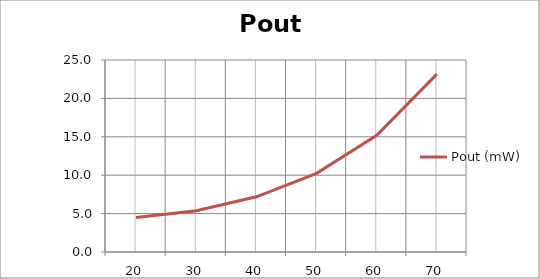
| Category | Pout (mW) |
|---|---|
| 20.0 | 4.491 |
| 30.0 | 5.366 |
| 40.0 | 7.188 |
| 50.0 | 10.248 |
| 60.0 | 15.197 |
| 70.0 | 23.159 |